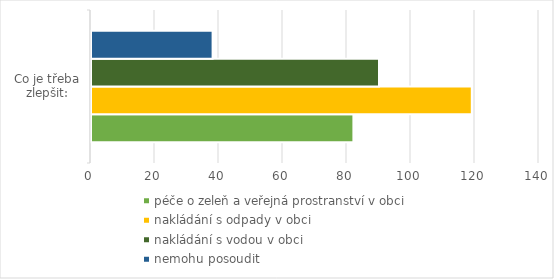
| Category | péče o zeleň a veřejná prostranství v obci | nakládání s odpady v obci | nakládání s vodou v obci | nemohu posoudit |
|---|---|---|---|---|
| 0 | 82 | 119 | 90 | 38 |